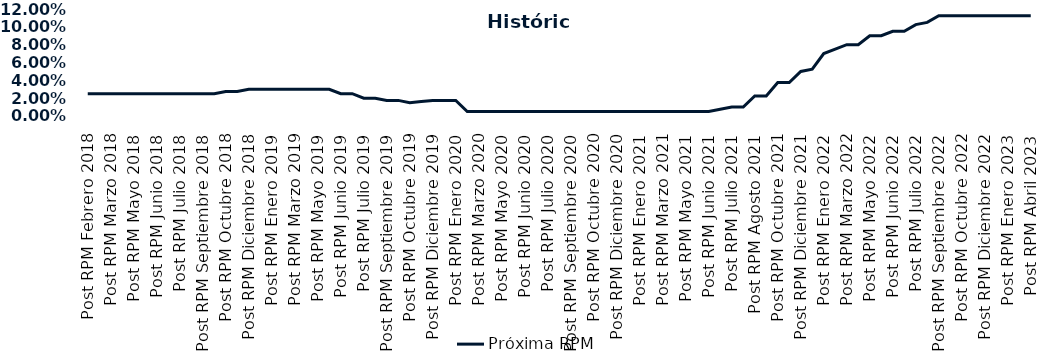
| Category | Próxima RPM |
|---|---|
| Post RPM Febrero 2018 | 0.025 |
| Pre RPM Marzo 2018 | 0.025 |
| Post RPM Marzo 2018 | 0.025 |
| Pre RPM Mayo 2018 | 0.025 |
| Post RPM Mayo 2018 | 0.025 |
| Pre RPM Junio 2018 | 0.025 |
| Post RPM Junio 2018 | 0.025 |
| Pre RPM Julio 2018 | 0.025 |
| Post RPM Julio 2018 | 0.025 |
| Pre RPM Septiembre 2018 | 0.025 |
| Post RPM Septiembre 2018 | 0.025 |
| Pre RPM Octubre 2018 | 0.025 |
| Post RPM Octubre 2018 | 0.028 |
| Pre RPM Diciembre 2018 | 0.028 |
| Post RPM Diciembre 2018 | 0.03 |
| Pre RPM Enero 2019 | 0.03 |
| Post RPM Enero 2019 | 0.03 |
| Pre RPM Marzo 2019 | 0.03 |
| Post RPM Marzo 2019 | 0.03 |
| Pre RPM Mayo 2019 | 0.03 |
| Post RPM Mayo 2019 | 0.03 |
| Pre RPM Junio 2019 | 0.03 |
| Post RPM Junio 2019 | 0.025 |
| Pre RPM Julio 2019 | 0.025 |
| Post RPM Julio 2019 | 0.02 |
| Pre RPM Septiembre 2019 | 0.02 |
| Post RPM Septiembre 2019 | 0.018 |
| Pre RPM Octubre 2019 | 0.018 |
| Post RPM Octubre 2019 | 0.015 |
| Pre RPM Diciembre 2019 | 0.016 |
| Post RPM Diciembre 2019 | 0.018 |
| Pre RPM Enero 2020 | 0.018 |
| Post RPM Enero 2020 | 0.018 |
| Pre RPM Marzo 2020 | 0.005 |
| Post RPM Marzo 2020 | 0.005 |
| Pre RPM Mayo 2020 | 0.005 |
| Post RPM Mayo 2020 | 0.005 |
| Pre RPM Junio 2020 | 0.005 |
| Post RPM Junio 2020 | 0.005 |
| Pre RPM Julio 2020 | 0.005 |
| Post RPM Julio 2020 | 0.005 |
| Pre RPM Septiembre 2020 | 0.005 |
| Post RPM Septiembre 2020 | 0.005 |
| Pre RPM Octubre 2020 | 0.005 |
| Post RPM Octubre 2020 | 0.005 |
| Pre RPM Diciembre 2020 | 0.005 |
| Post RPM Diciembre 2020 | 0.005 |
| Pre RPM Enero 2021 | 0.005 |
| Post RPM Enero 2021 | 0.005 |
| Pre RPM Marzo 2021 | 0.005 |
| Post RPM Marzo 2021 | 0.005 |
| Pre RPM Mayo 2021 | 0.005 |
| Post RPM Mayo 2021 | 0.005 |
| Pre RPM Junio 2021 | 0.005 |
| Post RPM Junio 2021 | 0.005 |
| Pre RPM Julio 2021 | 0.008 |
| Post RPM Julio 2021 | 0.01 |
| Pre RPM Agosto 2021 | 0.01 |
| Post RPM Agosto 2021 | 0.022 |
| Pre RPM Octubre 2021 | 0.022 |
| Post RPM Octubre 2021 | 0.038 |
| Pre RPM Diciembre 2021 | 0.038 |
| Post RPM Diciembre 2021 | 0.05 |
| Pre RPM Enero 2022 | 0.052 |
| Post RPM Enero 2022 | 0.07 |
| Pre RPM Marzo 2022 | 0.075 |
| Post RPM Marzo 2022 | 0.08 |
| Pre RPM Mayo 2022 | 0.08 |
| Post RPM Mayo 2022 | 0.09 |
| Pre RPM Junio 2022 | 0.09 |
| Post RPM Junio 2022 | 0.095 |
| Pre RPM Julio 2022 | 0.095 |
| Post RPM Julio 2022 | 0.102 |
| Pre RPM Septiembre 2022 | 0.105 |
| Post RPM Septiembre 2022 | 0.112 |
| Pre RPM Octubre 2022 | 0.112 |
| Post RPM Octubre 2022 | 0.112 |
| Pre RPM Diciembre 2022 | 0.112 |
| Post RPM Diciembre 2022 | 0.112 |
| Pre RPM Enero 2023 | 0.112 |
| Post RPM Enero 2023 | 0.112 |
| Pre RPM Abril 2023 | 0.112 |
| Post RPM Abril 2023 | 0.112 |